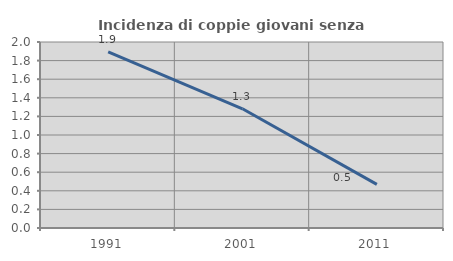
| Category | Incidenza di coppie giovani senza figli |
|---|---|
| 1991.0 | 1.894 |
| 2001.0 | 1.282 |
| 2011.0 | 0.469 |